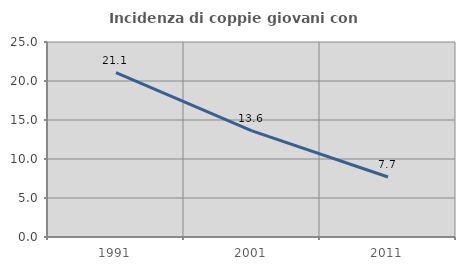
| Category | Incidenza di coppie giovani con figli |
|---|---|
| 1991.0 | 21.061 |
| 2001.0 | 13.609 |
| 2011.0 | 7.688 |